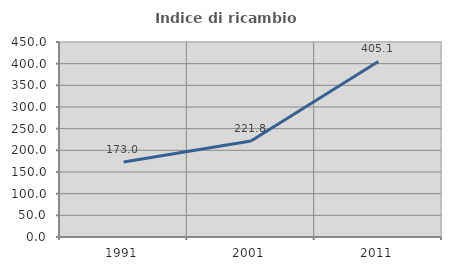
| Category | Indice di ricambio occupazionale  |
|---|---|
| 1991.0 | 172.973 |
| 2001.0 | 221.774 |
| 2011.0 | 405.128 |